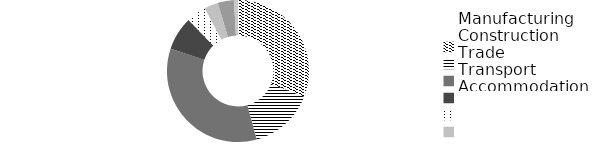
| Category | liczba przedsię-
biorstw 
number of 
enterprises  |
|---|---|
| Manufacturing  | 14724 |
| Construction  | 7066 |
| Trade  | 16351 |
| Transport | 3646 |
| Accommodation | 2145 |
| Information | 1510 |
| Administration | 1750 |
| Arts | 432 |